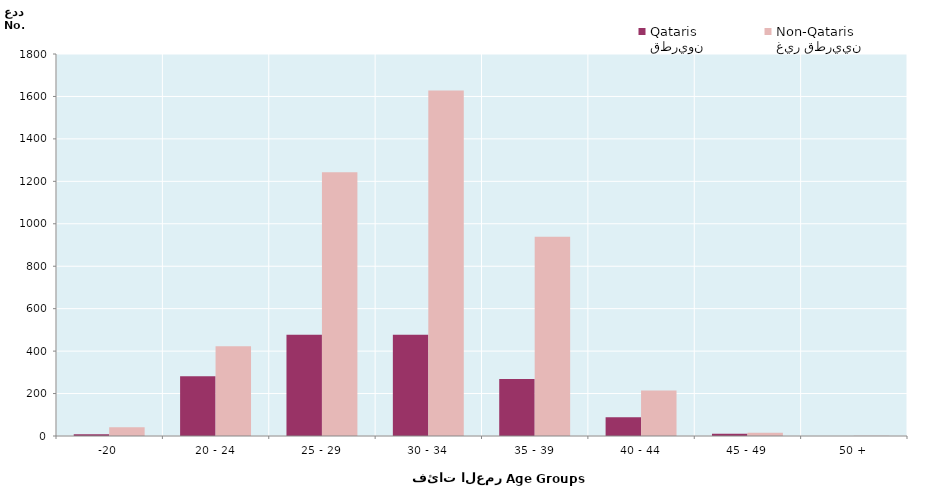
| Category | قطريون
Qataris | غير قطريين
Non-Qataris |
|---|---|---|
| -20 | 8 | 41 |
| 20 - 24 | 281 | 423 |
| 25 - 29 | 477 | 1243 |
| 30 - 34 | 477 | 1628 |
| 35 - 39 | 269 | 939 |
| 40 - 44 | 88 | 214 |
| 45 - 49 | 11 | 15 |
| 50 + | 0 | 1 |